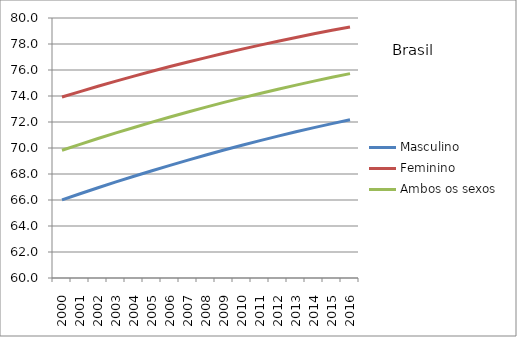
| Category | Masculino | Feminino | Ambos os sexos |
|---|---|---|---|
| 2000.0 | 66.006 | 73.92 | 69.826 |
| 2001.0 | 66.481 | 74.34 | 70.284 |
| 2002.0 | 66.941 | 74.746 | 70.727 |
| 2003.0 | 67.389 | 75.141 | 71.158 |
| 2004.0 | 67.827 | 75.526 | 71.58 |
| 2005.0 | 68.253 | 75.901 | 71.989 |
| 2006.0 | 68.668 | 76.264 | 72.388 |
| 2007.0 | 69.07 | 76.616 | 72.773 |
| 2008.0 | 69.463 | 76.955 | 73.146 |
| 2009.0 | 69.842 | 77.285 | 73.507 |
| 2010.0 | 70.21 | 77.605 | 73.857 |
| 2011.0 | 70.568 | 77.915 | 74.196 |
| 2012.0 | 70.912 | 78.215 | 74.523 |
| 2013.0 | 71.245 | 78.505 | 74.839 |
| 2014.0 | 71.567 | 78.784 | 75.143 |
| 2015.0 | 71.877 | 79.052 | 75.436 |
| 2016.0 | 72.176 | 79.311 | 75.719 |